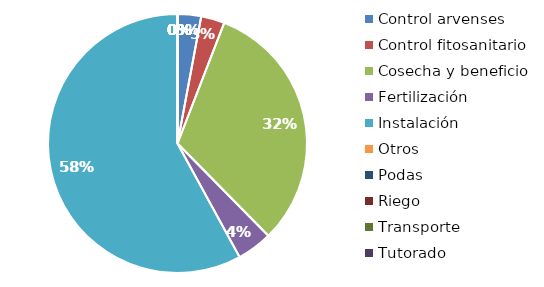
| Category | Valor |
|---|---|
| Control arvenses | 50000 |
| Control fitosanitario | 50000 |
| Cosecha y beneficio | 540000 |
| Fertilización | 75000 |
| Instalación | 986000 |
| Otros | 0 |
| Podas | 0 |
| Riego | 0 |
| Transporte | 0 |
| Tutorado | 0 |